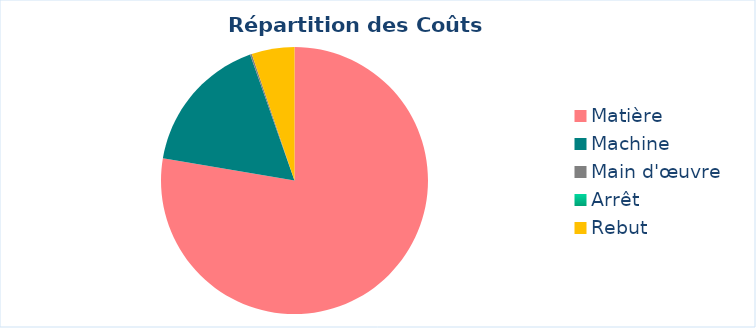
| Category | Series 0 | Series 1 |
|---|---|---|
| Matière | 3738.81 |  |
| Machine | 815 |  |
| Main d'œuvre | 10 |  |
| Arrêt | 0 |  |
| Rebut | 249.59 |  |